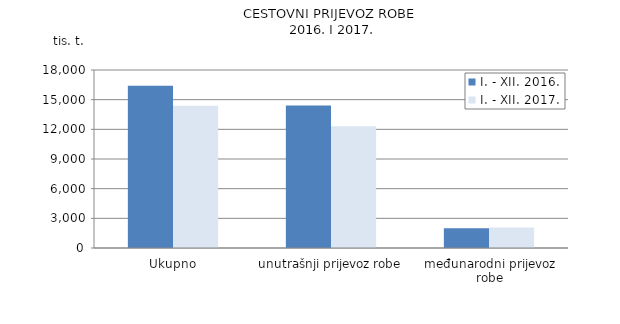
| Category | I. - XII. 2016. | I. - XII. 2017. |
|---|---|---|
| Ukupno | 16406 | 14397 |
| unutrašnji prijevoz robe | 14413 | 12321 |
| međunarodni prijevoz robe | 1993 | 2076 |